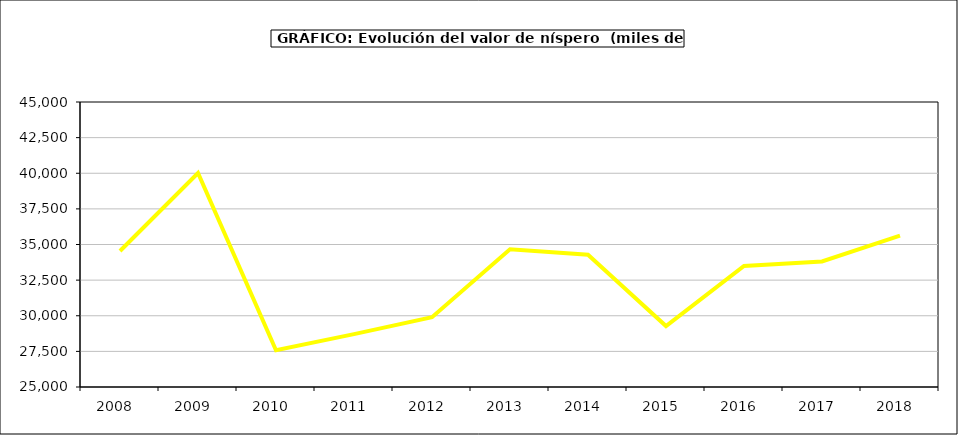
| Category | valor níspero |
|---|---|
| 2008.0 | 34546.071 |
| 2009.0 | 40013.597 |
| 2010.0 | 27580.978 |
| 2011.0 | 28708.277 |
| 2012.0 | 29897.05 |
| 2013.0 | 34664.445 |
| 2014.0 | 34281.045 |
| 2015.0 | 29278 |
| 2016.0 | 33490 |
| 2017.0 | 33807.127 |
| 2018.0 | 35617.316 |